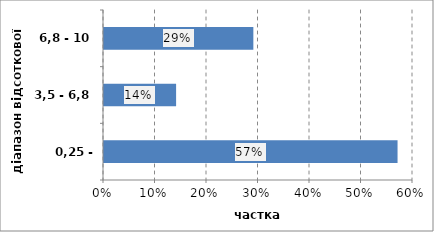
| Category | Series 0 |
|---|---|
| 0,25 - 3,5 | 0.57 |
| 3,5 - 6,8 | 0.14 |
| 6,8 - 10 | 0.29 |